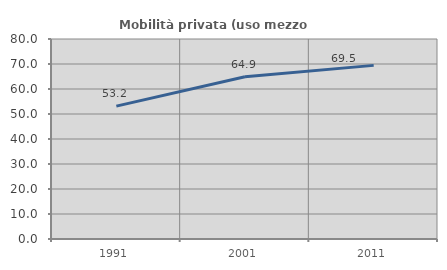
| Category | Mobilità privata (uso mezzo privato) |
|---|---|
| 1991.0 | 53.15 |
| 2001.0 | 64.906 |
| 2011.0 | 69.452 |